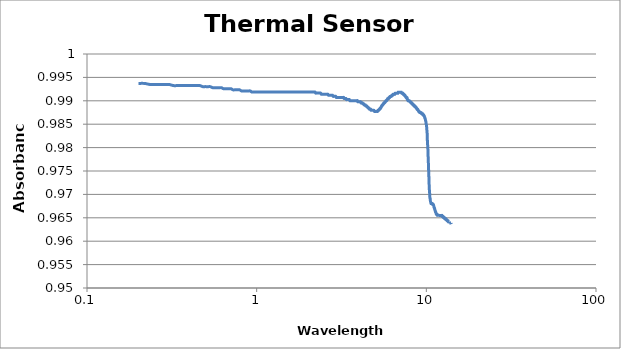
| Category | Absorbance |
|---|---|
| 0.20087 | 0.994 |
| 0.21834 | 0.994 |
| 0.23581 | 0.993 |
| 0.25328 | 0.993 |
| 0.27074 | 0.993 |
| 0.28821 | 0.993 |
| 0.30568 | 0.993 |
| 0.32314 | 0.993 |
| 0.34061 | 0.993 |
| 0.35808 | 0.993 |
| 0.37555 | 0.993 |
| 0.39301 | 0.993 |
| 0.41048 | 0.993 |
| 0.42795 | 0.993 |
| 0.44541 | 0.993 |
| 0.46288 | 0.993 |
| 0.48035 | 0.993 |
| 0.49782 | 0.993 |
| 0.51528 | 0.993 |
| 0.53275 | 0.993 |
| 0.55022 | 0.993 |
| 0.56769 | 0.993 |
| 0.58515 | 0.993 |
| 0.60262 | 0.993 |
| 0.62009 | 0.993 |
| 0.63755 | 0.993 |
| 0.65502 | 0.993 |
| 0.67249 | 0.993 |
| 0.68996 | 0.993 |
| 0.70742 | 0.993 |
| 0.72489 | 0.992 |
| 0.74236 | 0.992 |
| 0.75983 | 0.992 |
| 0.77729 | 0.992 |
| 0.79476 | 0.992 |
| 0.81223 | 0.992 |
| 0.82969 | 0.992 |
| 0.84716 | 0.992 |
| 0.86463 | 0.992 |
| 0.8821 | 0.992 |
| 0.89956 | 0.992 |
| 0.91703 | 0.992 |
| 0.9345 | 0.992 |
| 0.95197 | 0.992 |
| 0.96943 | 0.992 |
| 0.9869 | 0.992 |
| 1.00437 | 0.992 |
| 1.02183 | 0.992 |
| 1.0393 | 0.992 |
| 1.05677 | 0.992 |
| 1.07424 | 0.992 |
| 1.0917 | 0.992 |
| 1.10917 | 0.992 |
| 1.12664 | 0.992 |
| 1.1441 | 0.992 |
| 1.16157 | 0.992 |
| 1.17904 | 0.992 |
| 1.19651 | 0.992 |
| 1.21397 | 0.992 |
| 1.23144 | 0.992 |
| 1.24891 | 0.992 |
| 1.26638 | 0.992 |
| 1.28384 | 0.992 |
| 1.30131 | 0.992 |
| 1.31878 | 0.992 |
| 1.33624 | 0.992 |
| 1.35371 | 0.992 |
| 1.37118 | 0.992 |
| 1.38865 | 0.992 |
| 1.40611 | 0.992 |
| 1.42358 | 0.992 |
| 1.44105 | 0.992 |
| 1.45852 | 0.992 |
| 1.47598 | 0.992 |
| 1.49345 | 0.992 |
| 1.51092 | 0.992 |
| 1.52838 | 0.992 |
| 1.54585 | 0.992 |
| 1.56332 | 0.992 |
| 1.58079 | 0.992 |
| 1.59825 | 0.992 |
| 1.61572 | 0.992 |
| 1.63319 | 0.992 |
| 1.65066 | 0.992 |
| 1.66812 | 0.992 |
| 1.68559 | 0.992 |
| 1.70306 | 0.992 |
| 1.72052 | 0.992 |
| 1.73799 | 0.992 |
| 1.75546 | 0.992 |
| 1.77293 | 0.992 |
| 1.79039 | 0.992 |
| 1.80786 | 0.992 |
| 1.82533 | 0.992 |
| 1.84279 | 0.992 |
| 1.86026 | 0.992 |
| 1.87773 | 0.992 |
| 1.8952 | 0.992 |
| 1.91266 | 0.992 |
| 1.93013 | 0.992 |
| 1.9476 | 0.992 |
| 1.96507 | 0.992 |
| 1.98253 | 0.992 |
| 2.0 | 0.992 |
| 2.01747 | 0.992 |
| 2.03493 | 0.992 |
| 2.0524 | 0.992 |
| 2.06987 | 0.992 |
| 2.08734 | 0.992 |
| 2.1048 | 0.992 |
| 2.12227 | 0.992 |
| 2.13974 | 0.992 |
| 2.15721 | 0.992 |
| 2.17467 | 0.992 |
| 2.19214 | 0.992 |
| 2.20961 | 0.992 |
| 2.22707 | 0.992 |
| 2.24454 | 0.992 |
| 2.26201 | 0.992 |
| 2.27948 | 0.992 |
| 2.29694 | 0.992 |
| 2.31441 | 0.992 |
| 2.33188 | 0.992 |
| 2.34934 | 0.992 |
| 2.36681 | 0.992 |
| 2.38428 | 0.992 |
| 2.40175 | 0.991 |
| 2.41921 | 0.991 |
| 2.43668 | 0.991 |
| 2.45415 | 0.991 |
| 2.47162 | 0.991 |
| 2.48908 | 0.991 |
| 2.50655 | 0.991 |
| 2.52402 | 0.991 |
| 2.54148 | 0.991 |
| 2.55895 | 0.991 |
| 2.57642 | 0.991 |
| 2.59389 | 0.991 |
| 2.61135 | 0.991 |
| 2.62882 | 0.991 |
| 2.64629 | 0.991 |
| 2.66376 | 0.991 |
| 2.68122 | 0.991 |
| 2.69869 | 0.991 |
| 2.71616 | 0.991 |
| 2.73362 | 0.991 |
| 2.75109 | 0.991 |
| 2.76856 | 0.991 |
| 2.78603 | 0.991 |
| 2.80349 | 0.991 |
| 2.82096 | 0.991 |
| 2.83843 | 0.991 |
| 2.8559 | 0.991 |
| 2.87336 | 0.991 |
| 2.89083 | 0.991 |
| 2.9083 | 0.991 |
| 2.92576 | 0.991 |
| 2.94323 | 0.991 |
| 2.9607 | 0.991 |
| 2.97817 | 0.991 |
| 2.99563 | 0.991 |
| 3.0131 | 0.991 |
| 3.03057 | 0.991 |
| 3.04803 | 0.991 |
| 3.0655 | 0.991 |
| 3.08297 | 0.991 |
| 3.10044 | 0.991 |
| 3.1179 | 0.991 |
| 3.13537 | 0.991 |
| 3.15284 | 0.991 |
| 3.17031 | 0.991 |
| 3.18777 | 0.991 |
| 3.20524 | 0.991 |
| 3.22271 | 0.991 |
| 3.24017 | 0.991 |
| 3.25764 | 0.991 |
| 3.27511 | 0.99 |
| 3.29258 | 0.99 |
| 3.31004 | 0.99 |
| 3.32751 | 0.99 |
| 3.34498 | 0.99 |
| 3.36245 | 0.99 |
| 3.37991 | 0.99 |
| 3.39738 | 0.99 |
| 3.41485 | 0.99 |
| 3.43231 | 0.99 |
| 3.44978 | 0.99 |
| 3.46725 | 0.99 |
| 3.48472 | 0.99 |
| 3.50218 | 0.99 |
| 3.51965 | 0.99 |
| 3.53712 | 0.99 |
| 3.55459 | 0.99 |
| 3.57205 | 0.99 |
| 3.58952 | 0.99 |
| 3.60699 | 0.99 |
| 3.62445 | 0.99 |
| 3.64192 | 0.99 |
| 3.65939 | 0.99 |
| 3.67686 | 0.99 |
| 3.69432 | 0.99 |
| 3.71179 | 0.99 |
| 3.72926 | 0.99 |
| 3.74672 | 0.99 |
| 3.76419 | 0.99 |
| 3.78166 | 0.99 |
| 3.79913 | 0.99 |
| 3.81659 | 0.99 |
| 3.83406 | 0.99 |
| 3.85153 | 0.99 |
| 3.869 | 0.99 |
| 3.88646 | 0.99 |
| 3.90393 | 0.99 |
| 3.9214 | 0.99 |
| 3.93886 | 0.99 |
| 3.95633 | 0.99 |
| 3.9738 | 0.99 |
| 3.99127 | 0.99 |
| 4.00873 | 0.99 |
| 4.0262 | 0.99 |
| 4.04367 | 0.99 |
| 4.06114 | 0.99 |
| 4.0786 | 0.99 |
| 4.09607 | 0.99 |
| 4.11354 | 0.99 |
| 4.131 | 0.99 |
| 4.14847 | 0.99 |
| 4.16594 | 0.99 |
| 4.18341 | 0.99 |
| 4.20087 | 0.99 |
| 4.21834 | 0.989 |
| 4.23581 | 0.989 |
| 4.25328 | 0.989 |
| 4.27074 | 0.989 |
| 4.28821 | 0.989 |
| 4.30568 | 0.989 |
| 4.32314 | 0.989 |
| 4.34061 | 0.989 |
| 4.35808 | 0.989 |
| 4.37555 | 0.989 |
| 4.39301 | 0.989 |
| 4.41048 | 0.989 |
| 4.42795 | 0.989 |
| 4.44541 | 0.989 |
| 4.46288 | 0.989 |
| 4.48035 | 0.989 |
| 4.49782 | 0.989 |
| 4.51528 | 0.989 |
| 4.53275 | 0.989 |
| 4.55022 | 0.988 |
| 4.56769 | 0.988 |
| 4.58515 | 0.988 |
| 4.60262 | 0.988 |
| 4.62009 | 0.988 |
| 4.63755 | 0.988 |
| 4.65502 | 0.988 |
| 4.67249 | 0.988 |
| 4.68996 | 0.988 |
| 4.70742 | 0.988 |
| 4.72489 | 0.988 |
| 4.74236 | 0.988 |
| 4.75983 | 0.988 |
| 4.77729 | 0.988 |
| 4.79476 | 0.988 |
| 4.81223 | 0.988 |
| 4.82969 | 0.988 |
| 4.84716 | 0.988 |
| 4.86463 | 0.988 |
| 4.8821 | 0.988 |
| 4.89956 | 0.988 |
| 4.91703 | 0.988 |
| 4.9345 | 0.988 |
| 4.95197 | 0.988 |
| 4.96943 | 0.988 |
| 4.9869 | 0.988 |
| 5.00437 | 0.988 |
| 5.02183 | 0.988 |
| 5.0393 | 0.988 |
| 5.05677 | 0.988 |
| 5.07424 | 0.988 |
| 5.0917 | 0.988 |
| 5.10917 | 0.988 |
| 5.12664 | 0.988 |
| 5.1441 | 0.988 |
| 5.16157 | 0.988 |
| 5.17904 | 0.988 |
| 5.19651 | 0.988 |
| 5.21397 | 0.988 |
| 5.23144 | 0.988 |
| 5.24891 | 0.988 |
| 5.26638 | 0.988 |
| 5.28384 | 0.988 |
| 5.30131 | 0.988 |
| 5.31878 | 0.988 |
| 5.33624 | 0.988 |
| 5.35371 | 0.988 |
| 5.37118 | 0.988 |
| 5.38865 | 0.988 |
| 5.40611 | 0.989 |
| 5.42358 | 0.989 |
| 5.44105 | 0.989 |
| 5.45852 | 0.989 |
| 5.47598 | 0.989 |
| 5.49345 | 0.989 |
| 5.51092 | 0.989 |
| 5.52838 | 0.989 |
| 5.54585 | 0.989 |
| 5.56332 | 0.989 |
| 5.58079 | 0.989 |
| 5.59825 | 0.989 |
| 5.61572 | 0.99 |
| 5.63319 | 0.99 |
| 5.65066 | 0.99 |
| 5.66812 | 0.99 |
| 5.68559 | 0.99 |
| 5.70306 | 0.99 |
| 5.72052 | 0.99 |
| 5.73799 | 0.99 |
| 5.75546 | 0.99 |
| 5.77293 | 0.99 |
| 5.79039 | 0.99 |
| 5.80786 | 0.99 |
| 5.82533 | 0.99 |
| 5.84279 | 0.99 |
| 5.86026 | 0.99 |
| 5.87773 | 0.99 |
| 5.8952 | 0.99 |
| 5.91266 | 0.99 |
| 5.93013 | 0.99 |
| 5.9476 | 0.99 |
| 5.96507 | 0.99 |
| 5.98253 | 0.99 |
| 6.0 | 0.99 |
| 6.01747 | 0.991 |
| 6.03493 | 0.991 |
| 6.0524 | 0.991 |
| 6.06987 | 0.991 |
| 6.08734 | 0.991 |
| 6.1048 | 0.991 |
| 6.12227 | 0.991 |
| 6.13974 | 0.991 |
| 6.15721 | 0.991 |
| 6.17467 | 0.991 |
| 6.19214 | 0.991 |
| 6.20961 | 0.991 |
| 6.22707 | 0.991 |
| 6.24454 | 0.991 |
| 6.26201 | 0.991 |
| 6.27948 | 0.991 |
| 6.29694 | 0.991 |
| 6.31441 | 0.991 |
| 6.33188 | 0.991 |
| 6.34934 | 0.991 |
| 6.36681 | 0.991 |
| 6.38428 | 0.991 |
| 6.40175 | 0.991 |
| 6.41921 | 0.991 |
| 6.43668 | 0.991 |
| 6.45415 | 0.991 |
| 6.47162 | 0.991 |
| 6.48908 | 0.991 |
| 6.50655 | 0.991 |
| 6.52402 | 0.991 |
| 6.54148 | 0.992 |
| 6.55895 | 0.992 |
| 6.57642 | 0.992 |
| 6.59389 | 0.992 |
| 6.61135 | 0.992 |
| 6.62882 | 0.992 |
| 6.64629 | 0.992 |
| 6.66376 | 0.992 |
| 6.68122 | 0.992 |
| 6.69869 | 0.992 |
| 6.71616 | 0.992 |
| 6.73362 | 0.992 |
| 6.75109 | 0.992 |
| 6.76856 | 0.992 |
| 6.78603 | 0.992 |
| 6.80349 | 0.992 |
| 6.82096 | 0.992 |
| 6.83843 | 0.992 |
| 6.8559 | 0.992 |
| 6.87336 | 0.992 |
| 6.89083 | 0.992 |
| 6.9083 | 0.992 |
| 6.92576 | 0.992 |
| 6.94323 | 0.992 |
| 6.9607 | 0.992 |
| 6.97817 | 0.992 |
| 6.99563 | 0.992 |
| 7.0131 | 0.992 |
| 7.03057 | 0.992 |
| 7.04803 | 0.992 |
| 7.0655 | 0.992 |
| 7.08297 | 0.992 |
| 7.10044 | 0.992 |
| 7.1179 | 0.992 |
| 7.13537 | 0.992 |
| 7.15284 | 0.992 |
| 7.17031 | 0.992 |
| 7.18777 | 0.992 |
| 7.20524 | 0.992 |
| 7.22271 | 0.992 |
| 7.24017 | 0.992 |
| 7.25764 | 0.992 |
| 7.27511 | 0.992 |
| 7.29258 | 0.992 |
| 7.31004 | 0.991 |
| 7.32751 | 0.991 |
| 7.34498 | 0.991 |
| 7.36245 | 0.991 |
| 7.37991 | 0.991 |
| 7.39738 | 0.991 |
| 7.41485 | 0.991 |
| 7.43231 | 0.991 |
| 7.44978 | 0.991 |
| 7.46725 | 0.991 |
| 7.48472 | 0.991 |
| 7.50218 | 0.991 |
| 7.51965 | 0.991 |
| 7.53712 | 0.991 |
| 7.55459 | 0.991 |
| 7.57205 | 0.991 |
| 7.58952 | 0.991 |
| 7.60699 | 0.991 |
| 7.62445 | 0.991 |
| 7.64192 | 0.991 |
| 7.65939 | 0.991 |
| 7.67686 | 0.991 |
| 7.69432 | 0.991 |
| 7.71179 | 0.99 |
| 7.72926 | 0.99 |
| 7.72926 | 0.99 |
| 7.74672 | 0.99 |
| 7.76419 | 0.99 |
| 7.78166 | 0.99 |
| 7.79913 | 0.99 |
| 7.81659 | 0.99 |
| 7.83406 | 0.99 |
| 7.85153 | 0.99 |
| 7.869 | 0.99 |
| 7.88646 | 0.99 |
| 7.90393 | 0.99 |
| 7.9214 | 0.99 |
| 7.93886 | 0.99 |
| 7.95633 | 0.99 |
| 7.9738 | 0.99 |
| 7.99127 | 0.99 |
| 8.00873 | 0.99 |
| 8.0262 | 0.99 |
| 8.04367 | 0.99 |
| 8.06114 | 0.99 |
| 8.0786 | 0.99 |
| 8.09607 | 0.99 |
| 8.11354 | 0.99 |
| 8.131 | 0.99 |
| 8.14847 | 0.99 |
| 8.16594 | 0.99 |
| 8.18341 | 0.99 |
| 8.20087 | 0.99 |
| 8.21834 | 0.99 |
| 8.23581 | 0.989 |
| 8.25328 | 0.989 |
| 8.27074 | 0.989 |
| 8.28821 | 0.989 |
| 8.30568 | 0.989 |
| 8.32314 | 0.989 |
| 8.34061 | 0.989 |
| 8.35808 | 0.989 |
| 8.37555 | 0.989 |
| 8.39301 | 0.989 |
| 8.41048 | 0.989 |
| 8.42795 | 0.989 |
| 8.44541 | 0.989 |
| 8.46288 | 0.989 |
| 8.48035 | 0.989 |
| 8.49782 | 0.989 |
| 8.51528 | 0.989 |
| 8.53275 | 0.989 |
| 8.55022 | 0.989 |
| 8.56769 | 0.989 |
| 8.58515 | 0.989 |
| 8.60262 | 0.989 |
| 8.62009 | 0.989 |
| 8.63755 | 0.989 |
| 8.65502 | 0.989 |
| 8.67249 | 0.989 |
| 8.68996 | 0.989 |
| 8.70742 | 0.989 |
| 8.72489 | 0.988 |
| 8.74236 | 0.988 |
| 8.75983 | 0.988 |
| 8.77729 | 0.988 |
| 8.79476 | 0.988 |
| 8.81223 | 0.988 |
| 8.82969 | 0.988 |
| 8.84716 | 0.988 |
| 8.86463 | 0.988 |
| 8.8821 | 0.988 |
| 8.89956 | 0.988 |
| 8.91703 | 0.988 |
| 8.9345 | 0.988 |
| 8.95197 | 0.988 |
| 8.96943 | 0.988 |
| 8.9869 | 0.988 |
| 9.00437 | 0.988 |
| 9.02183 | 0.988 |
| 9.0393 | 0.988 |
| 9.05677 | 0.988 |
| 9.07424 | 0.988 |
| 9.0917 | 0.988 |
| 9.10917 | 0.988 |
| 9.12664 | 0.987 |
| 9.1441 | 0.987 |
| 9.16157 | 0.987 |
| 9.17904 | 0.987 |
| 9.19651 | 0.987 |
| 9.21397 | 0.987 |
| 9.23144 | 0.987 |
| 9.24891 | 0.987 |
| 9.26638 | 0.987 |
| 9.28384 | 0.987 |
| 9.30131 | 0.987 |
| 9.31878 | 0.987 |
| 9.33624 | 0.987 |
| 9.35371 | 0.987 |
| 9.37118 | 0.987 |
| 9.38865 | 0.987 |
| 9.40611 | 0.987 |
| 9.42358 | 0.987 |
| 9.44105 | 0.987 |
| 9.45852 | 0.987 |
| 9.47598 | 0.987 |
| 9.49345 | 0.987 |
| 9.51092 | 0.987 |
| 9.52838 | 0.987 |
| 9.54585 | 0.987 |
| 9.56332 | 0.987 |
| 9.58079 | 0.987 |
| 9.59825 | 0.987 |
| 9.61572 | 0.987 |
| 9.63319 | 0.987 |
| 9.65066 | 0.987 |
| 9.66812 | 0.987 |
| 9.68559 | 0.987 |
| 9.70306 | 0.987 |
| 9.72052 | 0.987 |
| 9.73799 | 0.987 |
| 9.75546 | 0.987 |
| 9.77293 | 0.987 |
| 9.79039 | 0.986 |
| 9.80786 | 0.986 |
| 9.82533 | 0.986 |
| 9.84279 | 0.986 |
| 9.86026 | 0.986 |
| 9.87773 | 0.986 |
| 9.8952 | 0.986 |
| 9.91266 | 0.986 |
| 9.93013 | 0.986 |
| 9.9476 | 0.985 |
| 9.96507 | 0.985 |
| 9.98253 | 0.985 |
| 10.0 | 0.985 |
| 10.01747 | 0.985 |
| 10.03493 | 0.984 |
| 10.0524 | 0.984 |
| 10.06987 | 0.984 |
| 10.06987 | 0.984 |
| 10.08734 | 0.984 |
| 10.1048 | 0.983 |
| 10.1048 | 0.983 |
| 10.12227 | 0.983 |
| 10.12227 | 0.983 |
| 10.12227 | 0.982 |
| 10.12227 | 0.982 |
| 10.12227 | 0.982 |
| 10.13974 | 0.982 |
| 10.13974 | 0.982 |
| 10.15721 | 0.982 |
| 10.15721 | 0.981 |
| 10.17467 | 0.981 |
| 10.17467 | 0.981 |
| 10.17467 | 0.981 |
| 10.19214 | 0.98 |
| 10.19214 | 0.98 |
| 10.20961 | 0.98 |
| 10.20961 | 0.98 |
| 10.22707 | 0.979 |
| 10.22707 | 0.979 |
| 10.24454 | 0.979 |
| 10.24454 | 0.979 |
| 10.24454 | 0.979 |
| 10.24454 | 0.978 |
| 10.24454 | 0.978 |
| 10.26201 | 0.978 |
| 10.26201 | 0.978 |
| 10.26201 | 0.977 |
| 10.27948 | 0.977 |
| 10.27948 | 0.977 |
| 10.27948 | 0.977 |
| 10.29694 | 0.976 |
| 10.29694 | 0.976 |
| 10.29694 | 0.976 |
| 10.29694 | 0.976 |
| 10.29694 | 0.976 |
| 10.31441 | 0.975 |
| 10.31441 | 0.975 |
| 10.33188 | 0.975 |
| 10.33188 | 0.975 |
| 10.33188 | 0.975 |
| 10.33188 | 0.974 |
| 10.33188 | 0.974 |
| 10.34934 | 0.974 |
| 10.34934 | 0.974 |
| 10.36681 | 0.974 |
| 10.36681 | 0.974 |
| 10.36681 | 0.973 |
| 10.36681 | 0.973 |
| 10.38428 | 0.973 |
| 10.38428 | 0.973 |
| 10.38428 | 0.972 |
| 10.38428 | 0.972 |
| 10.40175 | 0.972 |
| 10.41921 | 0.972 |
| 10.41921 | 0.971 |
| 10.41921 | 0.971 |
| 10.41921 | 0.971 |
| 10.43668 | 0.971 |
| 10.45415 | 0.971 |
| 10.45415 | 0.97 |
| 10.47162 | 0.97 |
| 10.47162 | 0.97 |
| 10.47162 | 0.97 |
| 10.48908 | 0.969 |
| 10.50655 | 0.969 |
| 10.52402 | 0.969 |
| 10.54148 | 0.969 |
| 10.55895 | 0.969 |
| 10.57642 | 0.968 |
| 10.59389 | 0.968 |
| 10.61135 | 0.968 |
| 10.62882 | 0.968 |
| 10.64629 | 0.968 |
| 10.66376 | 0.968 |
| 10.68122 | 0.968 |
| 10.69869 | 0.968 |
| 10.71616 | 0.968 |
| 10.73362 | 0.968 |
| 10.75109 | 0.968 |
| 10.76856 | 0.968 |
| 10.78603 | 0.968 |
| 10.80349 | 0.968 |
| 10.82096 | 0.968 |
| 10.83843 | 0.968 |
| 10.8559 | 0.968 |
| 10.87336 | 0.968 |
| 10.89083 | 0.968 |
| 10.9083 | 0.968 |
| 10.92576 | 0.968 |
| 10.94323 | 0.968 |
| 10.9607 | 0.968 |
| 10.97817 | 0.968 |
| 10.99563 | 0.968 |
| 11.0131 | 0.968 |
| 11.03057 | 0.968 |
| 11.04803 | 0.968 |
| 11.0655 | 0.968 |
| 11.08297 | 0.967 |
| 11.10044 | 0.967 |
| 11.1179 | 0.967 |
| 11.13537 | 0.967 |
| 11.15284 | 0.967 |
| 11.17031 | 0.967 |
| 11.18777 | 0.967 |
| 11.20524 | 0.967 |
| 11.22271 | 0.967 |
| 11.24017 | 0.967 |
| 11.25764 | 0.967 |
| 11.27511 | 0.966 |
| 11.29258 | 0.966 |
| 11.31004 | 0.966 |
| 11.32751 | 0.966 |
| 11.34498 | 0.966 |
| 11.36245 | 0.966 |
| 11.37991 | 0.966 |
| 11.39738 | 0.966 |
| 11.41485 | 0.966 |
| 11.43231 | 0.966 |
| 11.44978 | 0.966 |
| 11.46725 | 0.966 |
| 11.48472 | 0.966 |
| 11.50218 | 0.966 |
| 11.51965 | 0.966 |
| 11.53712 | 0.966 |
| 11.55459 | 0.966 |
| 11.57205 | 0.966 |
| 11.58952 | 0.966 |
| 11.60699 | 0.966 |
| 11.62445 | 0.966 |
| 11.64192 | 0.966 |
| 11.65939 | 0.966 |
| 11.67686 | 0.966 |
| 11.69432 | 0.966 |
| 11.71179 | 0.966 |
| 11.72926 | 0.966 |
| 11.74672 | 0.966 |
| 11.76419 | 0.966 |
| 11.78166 | 0.966 |
| 11.79913 | 0.966 |
| 11.81659 | 0.966 |
| 11.83406 | 0.966 |
| 11.85153 | 0.966 |
| 11.869 | 0.966 |
| 11.88646 | 0.966 |
| 11.90393 | 0.966 |
| 11.9214 | 0.966 |
| 11.93886 | 0.966 |
| 11.95633 | 0.966 |
| 11.9738 | 0.966 |
| 11.99127 | 0.966 |
| 12.00873 | 0.966 |
| 12.0262 | 0.966 |
| 12.04367 | 0.966 |
| 12.06114 | 0.966 |
| 12.0786 | 0.966 |
| 12.09607 | 0.966 |
| 12.11354 | 0.966 |
| 12.131 | 0.966 |
| 12.14847 | 0.966 |
| 12.16594 | 0.966 |
| 12.18341 | 0.966 |
| 12.20087 | 0.966 |
| 12.21834 | 0.966 |
| 12.23581 | 0.966 |
| 12.25328 | 0.966 |
| 12.27074 | 0.966 |
| 12.28821 | 0.966 |
| 12.30568 | 0.966 |
| 12.32314 | 0.966 |
| 12.34061 | 0.966 |
| 12.35808 | 0.966 |
| 12.37555 | 0.966 |
| 12.39301 | 0.965 |
| 12.41048 | 0.965 |
| 12.42795 | 0.965 |
| 12.44541 | 0.965 |
| 12.46288 | 0.965 |
| 12.48035 | 0.965 |
| 12.49782 | 0.965 |
| 12.51528 | 0.965 |
| 12.53275 | 0.965 |
| 12.55022 | 0.965 |
| 12.56769 | 0.965 |
| 12.58515 | 0.965 |
| 12.60262 | 0.965 |
| 12.62009 | 0.965 |
| 12.63755 | 0.965 |
| 12.65502 | 0.965 |
| 12.67249 | 0.965 |
| 12.68996 | 0.965 |
| 12.70742 | 0.965 |
| 12.72489 | 0.965 |
| 12.74236 | 0.965 |
| 12.75983 | 0.965 |
| 12.77729 | 0.965 |
| 12.79476 | 0.965 |
| 12.81223 | 0.965 |
| 12.82969 | 0.965 |
| 12.84716 | 0.965 |
| 12.86463 | 0.965 |
| 12.8821 | 0.965 |
| 12.89956 | 0.965 |
| 12.91703 | 0.965 |
| 12.9345 | 0.965 |
| 12.95197 | 0.965 |
| 12.96943 | 0.965 |
| 12.9869 | 0.965 |
| 13.00437 | 0.965 |
| 13.02183 | 0.965 |
| 13.0393 | 0.965 |
| 13.05677 | 0.965 |
| 13.07424 | 0.965 |
| 13.0917 | 0.965 |
| 13.10917 | 0.965 |
| 13.12664 | 0.965 |
| 13.1441 | 0.965 |
| 13.16157 | 0.965 |
| 13.17904 | 0.965 |
| 13.19651 | 0.965 |
| 13.21397 | 0.965 |
| 13.23144 | 0.964 |
| 13.24891 | 0.964 |
| 13.26638 | 0.964 |
| 13.28384 | 0.964 |
| 13.30131 | 0.964 |
| 13.31878 | 0.964 |
| 13.33624 | 0.964 |
| 13.35371 | 0.964 |
| 13.37118 | 0.964 |
| 13.38865 | 0.964 |
| 13.40611 | 0.964 |
| 13.42358 | 0.964 |
| 13.44105 | 0.964 |
| 13.45852 | 0.964 |
| 13.47598 | 0.964 |
| 13.49345 | 0.964 |
| 13.51092 | 0.964 |
| 13.52838 | 0.964 |
| 13.54585 | 0.964 |
| 13.56332 | 0.964 |
| 13.58079 | 0.964 |
| 13.59825 | 0.964 |
| 13.61572 | 0.964 |
| 13.63319 | 0.964 |
| 13.65066 | 0.964 |
| 13.66812 | 0.964 |
| 13.68559 | 0.964 |
| 13.70306 | 0.964 |
| 13.72052 | 0.964 |
| 13.73799 | 0.964 |
| 13.75546 | 0.964 |
| 13.77293 | 0.964 |
| 13.79039 | 0.964 |
| 13.80786 | 0.964 |
| 13.82533 | 0.964 |
| 13.84279 | 0.964 |
| 13.86026 | 0.964 |
| 13.87773 | 0.964 |
| 13.8952 | 0.964 |
| 13.91266 | 0.964 |
| 13.93013 | 0.964 |
| 13.9476 | 0.964 |
| 13.96507 | 0.964 |
| 13.98253 | 0.964 |
| 14.0 | 0.964 |
| 14.01747 | 0.964 |